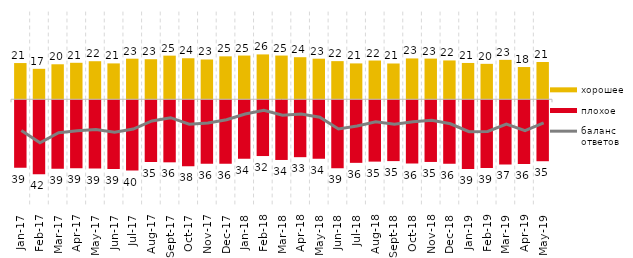
| Category | хорошее | плохое |
|---|---|---|
| 2017-01-01 | 20.75 | -38.65 |
| 2017-02-01 | 17.45 | -42.4 |
| 2017-03-01 | 20.05 | -39.25 |
| 2017-04-01 | 20.9 | -39 |
| 2017-05-01 | 21.8 | -39.15 |
| 2017-06-01 | 20.55 | -39.4 |
| 2017-07-01 | 23.25 | -40.3 |
| 2017-08-01 | 22.95 | -35.35 |
| 2017-09-01 | 25 | -35.55 |
| 2017-10-01 | 23.5 | -37.75 |
| 2017-11-01 | 22.8 | -36.35 |
| 2017-12-01 | 24.6 | -36.3 |
| 2018-01-01 | 25.05 | -33.5 |
| 2018-02-01 | 25.7 | -31.95 |
| 2018-03-01 | 25.05 | -34.2 |
| 2018-04-01 | 24.1 | -32.6 |
| 2018-05-01 | 23.25 | -33.5 |
| 2018-06-01 | 21.85 | -38.9 |
| 2018-07-01 | 20.55 | -35.85 |
| 2018-08-01 | 22.2 | -35.15 |
| 2018-09-01 | 20.5 | -34.85 |
| 2018-10-01 | 23.4 | -36.25 |
| 2018-11-01 | 23.303 | -35.329 |
| 2018-12-01 | 22.25 | -36.3 |
| 2019-01-01 | 20.8 | -39.35 |
| 2019-02-01 | 20.3 | -38.75 |
| 2019-03-01 | 22.576 | -36.748 |
| 2019-04-01 | 18.465 | -36.485 |
| 2019-05-01 | 21.347 | -34.918 |